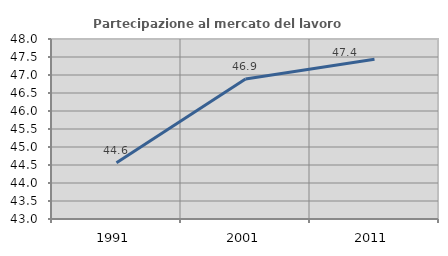
| Category | Partecipazione al mercato del lavoro  femminile |
|---|---|
| 1991.0 | 44.562 |
| 2001.0 | 46.891 |
| 2011.0 | 47.435 |